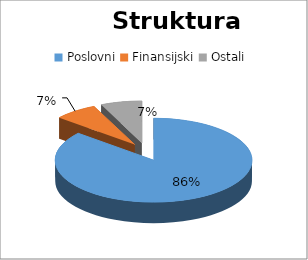
| Category | Series 0 |
|---|---|
| Poslovni | 325271 |
| Finansijski | 26858 |
| Ostali | 25647.29 |